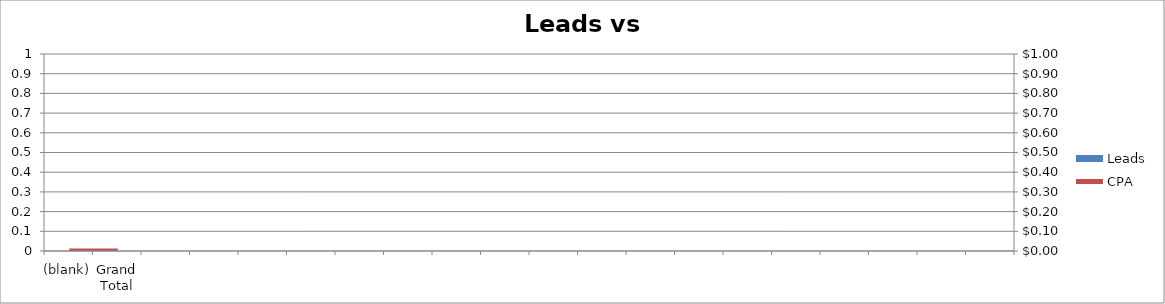
| Category | Leads |
|---|---|
| (blank) | 0 |
| Grand Total | 0 |